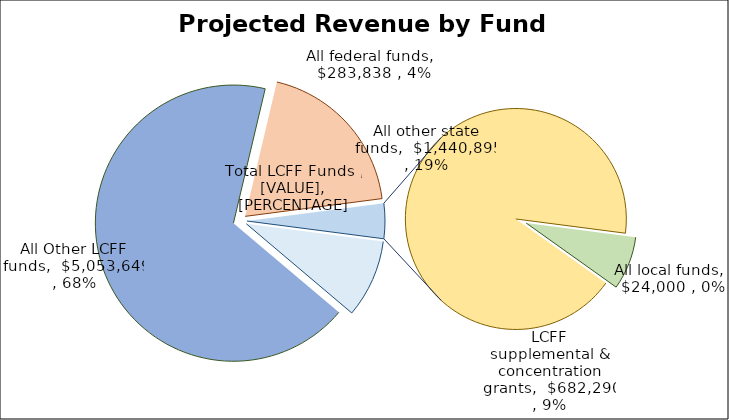
| Category | Series 0 |
|---|---|
| LCFF supplemental & concentration grants | 682290 |
| All Other LCFF funds | 5053649 |
| All other state funds | 1440895 |
| All local funds | 24000 |
| All federal funds | 283838 |